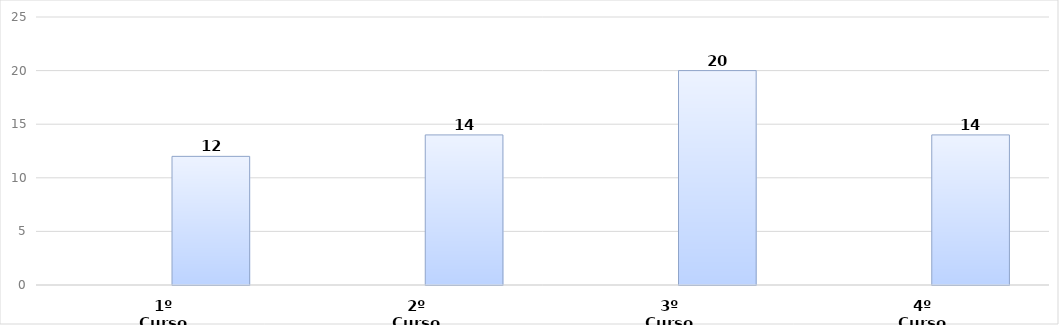
| Category | Series 0 | Series 1 |
|---|---|---|
| 1º Curso |  | 12 |
| 2º Curso |  | 14 |
| 3º Curso |  | 20 |
| 4º Curso |  | 14 |